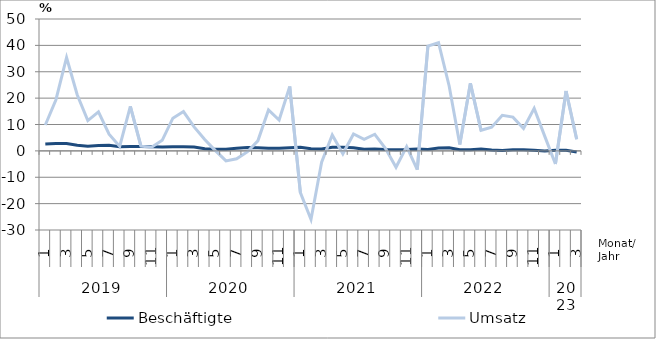
| Category | Beschäftigte | Umsatz |
|---|---|---|
| 0 | 2.6 | 9.8 |
| 1 | 2.8 | 19.4 |
| 2 | 2.8 | 35.4 |
| 3 | 2.1 | 21.3 |
| 4 | 1.8 | 11.5 |
| 5 | 2 | 14.8 |
| 6 | 2.1 | 6.3 |
| 7 | 1.6 | 1.7 |
| 8 | 1.7 | 16.9 |
| 9 | 1.7 | 1.8 |
| 10 | 1.6 | 1.4 |
| 11 | 1.5 | 4 |
| 12 | 1.6 | 12.4 |
| 13 | 1.6 | 14.9 |
| 14 | 1.5 | 9.1 |
| 15 | 0.8 | 4.3 |
| 16 | 0.6 | 0.1 |
| 17 | 0.6 | -3.8 |
| 18 | 1 | -3 |
| 19 | 1.3 | -0.4 |
| 20 | 1.2 | 3.8 |
| 21 | 1 | 15.5 |
| 22 | 1 | 11.7 |
| 23 | 1.2 | 24.4 |
| 24 | 1.4 | -15.8 |
| 25 | 0.8 | -26 |
| 26 | 0.7 | -4.3 |
| 27 | 1.4 | 6 |
| 28 | 1.4 | -1.1 |
| 29 | 1.2 | 6.4 |
| 30 | 0.6 | 4.4 |
| 31 | 0.7 | 6.3 |
| 32 | 0.5 | 1 |
| 33 | 0.4 | -6.2 |
| 34 | 0.5 | 1.6 |
| 35 | 0.7 | -7.1 |
| 36 | 0.5 | 39.7 |
| 37 | 1.1 | 41 |
| 38 | 1.2 | 24.6 |
| 39 | 0.4 | 2.4 |
| 40 | 0.4 | 25.6 |
| 41 | 0.7 | 7.8 |
| 42 | 0.3 | 9 |
| 43 | 0.1 | 13.5 |
| 44 | 0.4 | 12.8 |
| 45 | 0.4 | 8.5 |
| 46 | 0.2 | 16.1 |
| 47 | 0 | 5.5 |
| 48 | 0.2 | -5 |
| 49 | 0.2 | 22.7 |
| 50 | -0.4 | 4.4 |